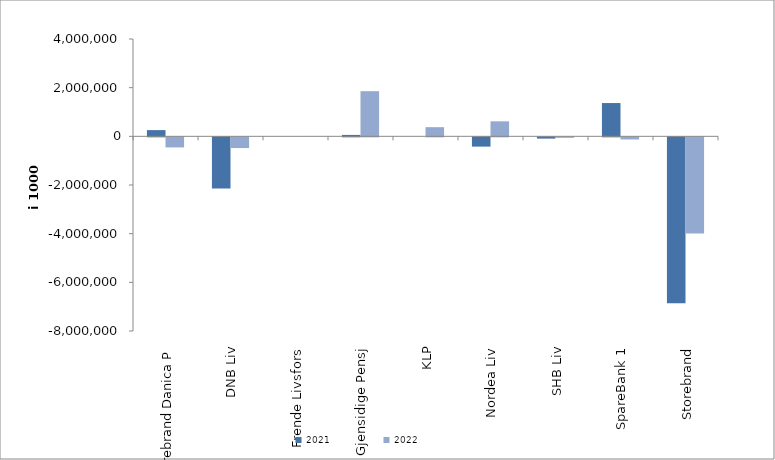
| Category | 2021 | 2022 |
|---|---|---|
| Storebrand Danica P | 255950.182 | -414494.574 |
| DNB Liv | -2100392 | -440667.455 |
| Frende Livsfors | 0 | 0 |
| Gjensidige Pensj | 58268.6 | 1855585 |
| KLP | 0 | 376440.529 |
| Nordea Liv | -381588.806 | 616541.348 |
| SHB Liv | -52194.126 | -20941.515 |
| SpareBank 1 | 1368033.236 | -87746.893 |
| Storebrand | -6819879.785 | -3951398.424 |